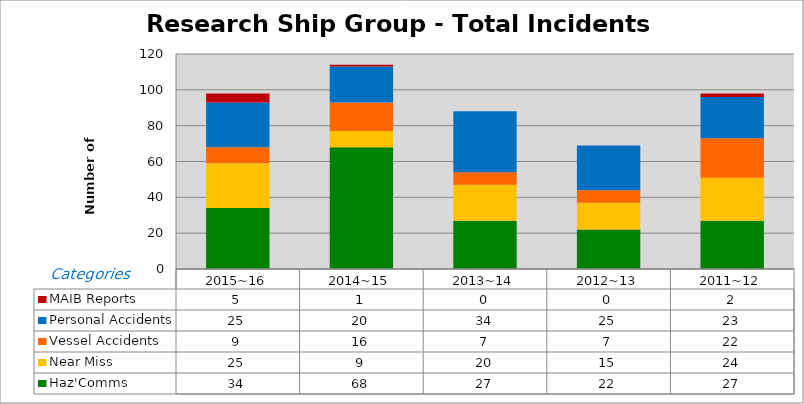
| Category | Haz'Comms | Near Miss | Vessel Accidents | Personal Accidents | MAIB Reports |
|---|---|---|---|---|---|
| 2015~16 | 34 | 25 | 9 | 25 | 5 |
| 2014~15 | 68 | 9 | 16 | 20 | 1 |
| 2013~14 | 27 | 20 | 7 | 34 | 0 |
| 2012~13 | 22 | 15 | 7 | 25 | 0 |
| 2011~12 | 27 | 24 | 22 | 23 | 2 |